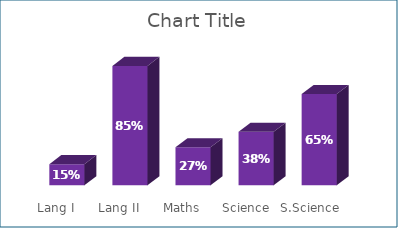
| Category | Marks |
|---|---|
| Lang I | 0.15 |
| Lang II | 0.85 |
| Maths | 0.27 |
| Science | 0.38 |
| S.Science | 0.65 |